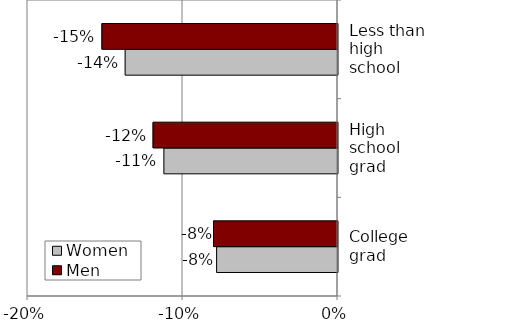
| Category | Women | Men |
|---|---|---|
| College grad | -0.078 | -0.08 |
| High school grad | -0.112 | -0.119 |
| Less than high school | -0.137 | -0.152 |